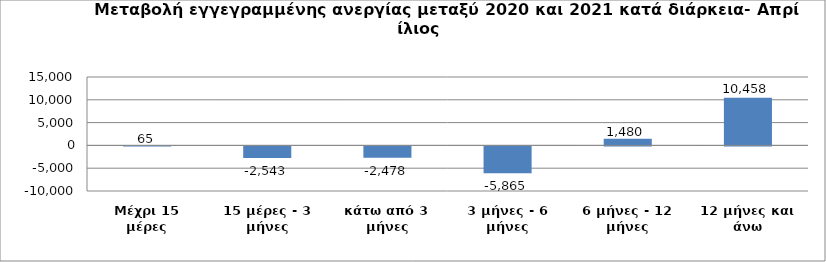
| Category | Series 0 |
|---|---|
| Μέχρι 15 μέρες | 65 |
| 15 μέρες - 3 μήνες | -2543 |
| κάτω από 3 μήνες | -2478 |
| 3 μήνες - 6 μήνες | -5865 |
| 6 μήνες - 12 μήνες | 1480 |
| 12 μήνες και άνω | 10458 |